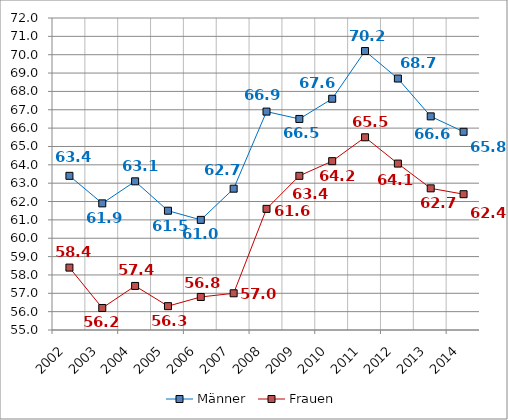
| Category | Männer | Frauen |
|---|---|---|
| 2002.0 | 63.4 | 58.4 |
| 2003.0 | 61.9 | 56.2 |
| 2004.0 | 63.1 | 57.4 |
| 2005.0 | 61.5 | 56.3 |
| 2006.0 | 61 | 56.8 |
| 2007.0 | 62.7 | 57 |
| 2008.0 | 66.9 | 61.6 |
| 2009.0 | 66.5 | 63.4 |
| 2010.0 | 67.6 | 64.2 |
| 2011.0 | 70.2 | 65.5 |
| 2012.0 | 68.701 | 64.067 |
| 2013.0 | 66.64 | 62.719 |
| 2014.0 | 65.8 | 62.4 |